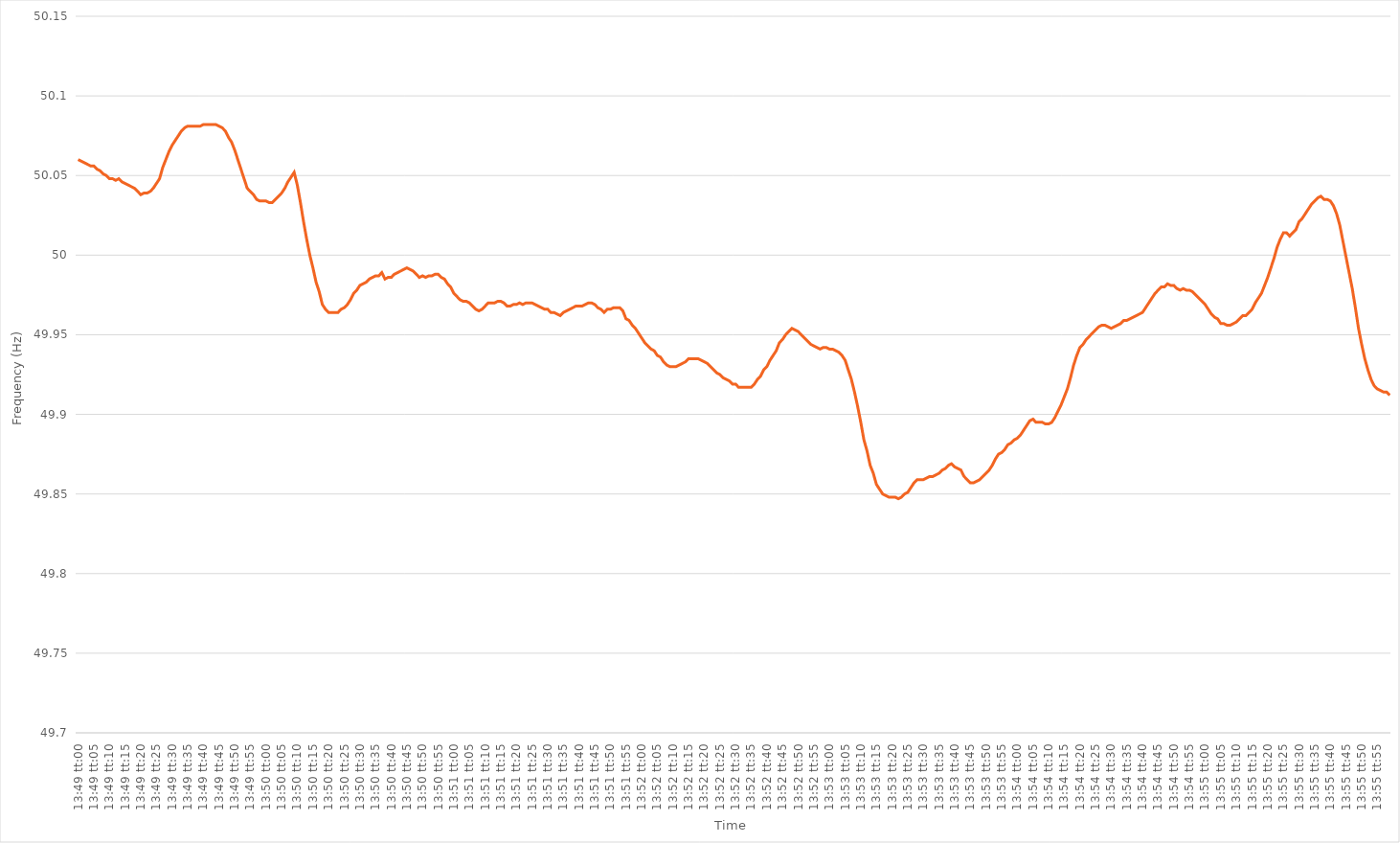
| Category | Series 0 |
|---|---|
| 0.5756944444444444 | 50.06 |
| 0.5757060185185185 | 50.059 |
| 0.5757175925925926 | 50.058 |
| 0.5757291666666667 | 50.057 |
| 0.5757407407407408 | 50.056 |
| 0.5757523148148148 | 50.056 |
| 0.5757638888888889 | 50.054 |
| 0.5757754629629629 | 50.053 |
| 0.575787037037037 | 50.051 |
| 0.5757986111111111 | 50.05 |
| 0.5758101851851852 | 50.048 |
| 0.5758217592592593 | 50.048 |
| 0.5758333333333333 | 50.047 |
| 0.5758449074074073 | 50.048 |
| 0.5758564814814815 | 50.046 |
| 0.5758680555555555 | 50.045 |
| 0.5758796296296297 | 50.044 |
| 0.5758912037037037 | 50.043 |
| 0.5759027777777778 | 50.042 |
| 0.5759143518518518 | 50.04 |
| 0.575925925925926 | 50.038 |
| 0.5759375 | 50.039 |
| 0.5759490740740741 | 50.039 |
| 0.5759606481481482 | 50.04 |
| 0.5759722222222222 | 50.042 |
| 0.5759837962962963 | 50.045 |
| 0.5759953703703703 | 50.048 |
| 0.5760069444444444 | 50.055 |
| 0.5760185185185185 | 50.06 |
| 0.5760300925925926 | 50.065 |
| 0.5760416666666667 | 50.069 |
| 0.5760532407407407 | 50.072 |
| 0.5760648148148148 | 50.075 |
| 0.5760763888888889 | 50.078 |
| 0.5760879629629629 | 50.08 |
| 0.5760995370370371 | 50.081 |
| 0.5761111111111111 | 50.081 |
| 0.5761226851851852 | 50.081 |
| 0.5761342592592592 | 50.081 |
| 0.5761458333333334 | 50.081 |
| 0.5761574074074074 | 50.082 |
| 0.5761689814814815 | 50.082 |
| 0.5761805555555556 | 50.082 |
| 0.5761921296296296 | 50.082 |
| 0.5762037037037037 | 50.082 |
| 0.5762152777777778 | 50.081 |
| 0.5762268518518519 | 50.08 |
| 0.5762384259259259 | 50.078 |
| 0.57625 | 50.074 |
| 0.5762615740740741 | 50.071 |
| 0.5762731481481481 | 50.066 |
| 0.5762847222222222 | 50.06 |
| 0.5762962962962963 | 50.054 |
| 0.5763078703703703 | 50.048 |
| 0.5763194444444445 | 50.042 |
| 0.5763310185185185 | 50.04 |
| 0.5763425925925926 | 50.038 |
| 0.5763541666666666 | 50.035 |
| 0.5763657407407408 | 50.034 |
| 0.5763773148148148 | 50.034 |
| 0.576388888888889 | 50.034 |
| 0.576400462962963 | 50.033 |
| 0.576412037037037 | 50.033 |
| 0.5764236111111111 | 50.035 |
| 0.5764351851851852 | 50.037 |
| 0.5764467592592593 | 50.039 |
| 0.5764583333333334 | 50.042 |
| 0.5764699074074074 | 50.046 |
| 0.5764814814814815 | 50.049 |
| 0.5764930555555555 | 50.052 |
| 0.5765046296296296 | 50.044 |
| 0.5765162037037037 | 50.033 |
| 0.5765277777777778 | 50.021 |
| 0.5765393518518519 | 50.01 |
| 0.5765509259259259 | 50 |
| 0.5765625 | 49.992 |
| 0.576574074074074 | 49.983 |
| 0.5765856481481482 | 49.977 |
| 0.5765972222222222 | 49.969 |
| 0.5766087962962964 | 49.966 |
| 0.5766203703703704 | 49.964 |
| 0.5766319444444444 | 49.964 |
| 0.5766435185185185 | 49.964 |
| 0.5766550925925926 | 49.964 |
| 0.5766666666666667 | 49.966 |
| 0.5766782407407408 | 49.967 |
| 0.5766898148148148 | 49.969 |
| 0.5767013888888889 | 49.972 |
| 0.5767129629629629 | 49.976 |
| 0.576724537037037 | 49.978 |
| 0.5767361111111111 | 49.981 |
| 0.5767476851851852 | 49.982 |
| 0.5767592592592593 | 49.983 |
| 0.5767708333333333 | 49.985 |
| 0.5767824074074074 | 49.986 |
| 0.5767939814814814 | 49.987 |
| 0.5768055555555556 | 49.987 |
| 0.5768171296296296 | 49.989 |
| 0.5768287037037038 | 49.985 |
| 0.5768402777777778 | 49.986 |
| 0.5768518518518518 | 49.986 |
| 0.5768634259259259 | 49.988 |
| 0.576875 | 49.989 |
| 0.5768865740740741 | 49.99 |
| 0.5768981481481482 | 49.991 |
| 0.5769097222222223 | 49.992 |
| 0.5769212962962963 | 49.991 |
| 0.5769328703703703 | 49.99 |
| 0.5769444444444444 | 49.988 |
| 0.5769560185185185 | 49.986 |
| 0.5769675925925926 | 49.987 |
| 0.5769791666666667 | 49.986 |
| 0.5769907407407407 | 49.987 |
| 0.5770023148148148 | 49.987 |
| 0.5770138888888888 | 49.988 |
| 0.577025462962963 | 49.988 |
| 0.577037037037037 | 49.986 |
| 0.5770486111111112 | 49.985 |
| 0.5770601851851852 | 49.982 |
| 0.5770717592592592 | 49.98 |
| 0.5770833333333333 | 49.976 |
| 0.5770949074074074 | 49.974 |
| 0.5771064814814815 | 49.972 |
| 0.5771180555555556 | 49.971 |
| 0.5771296296296297 | 49.971 |
| 0.5771412037037037 | 49.97 |
| 0.5771527777777777 | 49.968 |
| 0.5771643518518519 | 49.966 |
| 0.5771759259259259 | 49.965 |
| 0.5771875 | 49.966 |
| 0.5771990740740741 | 49.968 |
| 0.5772106481481482 | 49.97 |
| 0.5772222222222222 | 49.97 |
| 0.5772337962962962 | 49.97 |
| 0.5772453703703704 | 49.971 |
| 0.5772569444444444 | 49.971 |
| 0.5772685185185186 | 49.97 |
| 0.5772800925925926 | 49.968 |
| 0.5772916666666666 | 49.968 |
| 0.5773032407407407 | 49.969 |
| 0.5773148148148148 | 49.969 |
| 0.5773263888888889 | 49.97 |
| 0.577337962962963 | 49.969 |
| 0.5773495370370371 | 49.97 |
| 0.5773611111111111 | 49.97 |
| 0.5773726851851851 | 49.97 |
| 0.5773842592592593 | 49.969 |
| 0.5773958333333333 | 49.968 |
| 0.5774074074074075 | 49.967 |
| 0.5774189814814815 | 49.966 |
| 0.5774305555555556 | 49.966 |
| 0.5774421296296296 | 49.964 |
| 0.5774537037037036 | 49.964 |
| 0.5774652777777778 | 49.963 |
| 0.5774768518518518 | 49.962 |
| 0.577488425925926 | 49.964 |
| 0.5775 | 49.965 |
| 0.577511574074074 | 49.966 |
| 0.5775231481481481 | 49.967 |
| 0.5775347222222222 | 49.968 |
| 0.5775462962962963 | 49.968 |
| 0.5775578703703704 | 49.968 |
| 0.5775694444444445 | 49.969 |
| 0.5775810185185185 | 49.97 |
| 0.5775925925925925 | 49.97 |
| 0.5776041666666667 | 49.969 |
| 0.5776157407407407 | 49.967 |
| 0.5776273148148149 | 49.966 |
| 0.5776388888888889 | 49.964 |
| 0.577650462962963 | 49.966 |
| 0.577662037037037 | 49.966 |
| 0.577673611111111 | 49.967 |
| 0.5776851851851852 | 49.967 |
| 0.5776967592592592 | 49.967 |
| 0.5777083333333334 | 49.965 |
| 0.5777199074074074 | 49.96 |
| 0.5777314814814815 | 49.959 |
| 0.5777430555555555 | 49.956 |
| 0.5777546296296296 | 49.954 |
| 0.5777662037037037 | 49.951 |
| 0.5777777777777778 | 49.948 |
| 0.5777893518518519 | 49.945 |
| 0.5778009259259259 | 49.943 |
| 0.5778125 | 49.941 |
| 0.5778240740740741 | 49.94 |
| 0.5778356481481481 | 49.937 |
| 0.5778472222222223 | 49.936 |
| 0.5778587962962963 | 49.933 |
| 0.5778703703703704 | 49.931 |
| 0.5778819444444444 | 49.93 |
| 0.5778935185185184 | 49.93 |
| 0.5779050925925926 | 49.93 |
| 0.5779166666666666 | 49.931 |
| 0.5779282407407408 | 49.932 |
| 0.5779398148148148 | 49.933 |
| 0.5779513888888889 | 49.935 |
| 0.5779629629629629 | 49.935 |
| 0.577974537037037 | 49.935 |
| 0.5779861111111111 | 49.935 |
| 0.5779976851851852 | 49.934 |
| 0.5780092592592593 | 49.933 |
| 0.5780208333333333 | 49.932 |
| 0.5780324074074074 | 49.93 |
| 0.5780439814814815 | 49.928 |
| 0.5780555555555555 | 49.926 |
| 0.5780671296296297 | 49.925 |
| 0.5780787037037037 | 49.923 |
| 0.5780902777777778 | 49.922 |
| 0.5781018518518518 | 49.921 |
| 0.578113425925926 | 49.919 |
| 0.578125 | 49.919 |
| 0.578136574074074 | 49.917 |
| 0.5781481481481482 | 49.917 |
| 0.5781597222222222 | 49.917 |
| 0.5781712962962963 | 49.917 |
| 0.5781828703703703 | 49.917 |
| 0.5781944444444445 | 49.919 |
| 0.5782060185185185 | 49.922 |
| 0.5782175925925926 | 49.924 |
| 0.5782291666666667 | 49.928 |
| 0.5782407407407407 | 49.93 |
| 0.5782523148148148 | 49.934 |
| 0.5782638888888889 | 49.937 |
| 0.578275462962963 | 49.94 |
| 0.5782870370370371 | 49.945 |
| 0.5782986111111111 | 49.947 |
| 0.5783101851851852 | 49.95 |
| 0.5783217592592592 | 49.952 |
| 0.5783333333333334 | 49.954 |
| 0.5783449074074074 | 49.953 |
| 0.5783564814814816 | 49.952 |
| 0.5783680555555556 | 49.95 |
| 0.5783796296296296 | 49.948 |
| 0.5783912037037037 | 49.946 |
| 0.5784027777777777 | 49.944 |
| 0.5784143518518519 | 49.943 |
| 0.5784259259259259 | 49.942 |
| 0.5784375 | 49.941 |
| 0.5784490740740741 | 49.942 |
| 0.5784606481481481 | 49.942 |
| 0.5784722222222222 | 49.941 |
| 0.5784837962962963 | 49.941 |
| 0.5784953703703704 | 49.94 |
| 0.5785069444444445 | 49.939 |
| 0.5785185185185185 | 49.937 |
| 0.5785300925925926 | 49.934 |
| 0.5785416666666666 | 49.928 |
| 0.5785532407407408 | 49.922 |
| 0.5785648148148148 | 49.914 |
| 0.578576388888889 | 49.905 |
| 0.578587962962963 | 49.895 |
| 0.578599537037037 | 49.884 |
| 0.5786111111111111 | 49.877 |
| 0.5786226851851851 | 49.868 |
| 0.5786342592592593 | 49.863 |
| 0.5786458333333333 | 49.856 |
| 0.5786574074074075 | 49.853 |
| 0.5786689814814815 | 49.85 |
| 0.5786805555555555 | 49.849 |
| 0.5786921296296296 | 49.848 |
| 0.5787037037037037 | 49.848 |
| 0.5787152777777778 | 49.848 |
| 0.5787268518518519 | 49.847 |
| 0.578738425925926 | 49.848 |
| 0.57875 | 49.85 |
| 0.578761574074074 | 49.851 |
| 0.5787731481481482 | 49.854 |
| 0.5787847222222222 | 49.857 |
| 0.5787962962962964 | 49.859 |
| 0.5788078703703704 | 49.859 |
| 0.5788194444444444 | 49.859 |
| 0.5788310185185185 | 49.86 |
| 0.5788425925925925 | 49.861 |
| 0.5788541666666667 | 49.861 |
| 0.5788657407407407 | 49.862 |
| 0.5788773148148149 | 49.863 |
| 0.5788888888888889 | 49.865 |
| 0.5789004629629629 | 49.866 |
| 0.578912037037037 | 49.868 |
| 0.5789236111111111 | 49.869 |
| 0.5789351851851852 | 49.867 |
| 0.5789467592592593 | 49.866 |
| 0.5789583333333334 | 49.865 |
| 0.5789699074074074 | 49.861 |
| 0.5789814814814814 | 49.859 |
| 0.5789930555555556 | 49.857 |
| 0.5790046296296296 | 49.857 |
| 0.5790162037037038 | 49.858 |
| 0.5790277777777778 | 49.859 |
| 0.5790393518518518 | 49.861 |
| 0.5790509259259259 | 49.863 |
| 0.5790625 | 49.865 |
| 0.5790740740740741 | 49.868 |
| 0.5790856481481481 | 49.872 |
| 0.5790972222222223 | 49.875 |
| 0.5791087962962963 | 49.876 |
| 0.5791203703703703 | 49.878 |
| 0.5791319444444444 | 49.881 |
| 0.5791435185185185 | 49.882 |
| 0.5791550925925926 | 49.884 |
| 0.5791666666666667 | 49.885 |
| 0.5791782407407408 | 49.887 |
| 0.5791898148148148 | 49.89 |
| 0.5792013888888888 | 49.893 |
| 0.579212962962963 | 49.896 |
| 0.579224537037037 | 49.897 |
| 0.5792361111111112 | 49.895 |
| 0.5792476851851852 | 49.895 |
| 0.5792592592592593 | 49.895 |
| 0.5792708333333333 | 49.894 |
| 0.5792824074074074 | 49.894 |
| 0.5792939814814815 | 49.895 |
| 0.5793055555555556 | 49.898 |
| 0.5793171296296297 | 49.902 |
| 0.5793287037037037 | 49.906 |
| 0.5793402777777777 | 49.911 |
| 0.5793518518518518 | 49.916 |
| 0.5793634259259259 | 49.923 |
| 0.579375 | 49.931 |
| 0.5793865740740741 | 49.937 |
| 0.5793981481481482 | 49.942 |
| 0.5794097222222222 | 49.944 |
| 0.5794212962962962 | 49.947 |
| 0.5794328703703704 | 49.949 |
| 0.5794444444444444 | 49.951 |
| 0.5794560185185186 | 49.953 |
| 0.5794675925925926 | 49.955 |
| 0.5794791666666667 | 49.956 |
| 0.5794907407407407 | 49.956 |
| 0.5795023148148148 | 49.955 |
| 0.5795138888888889 | 49.954 |
| 0.579525462962963 | 49.955 |
| 0.5795370370370371 | 49.956 |
| 0.5795486111111111 | 49.957 |
| 0.5795601851851852 | 49.959 |
| 0.5795717592592592 | 49.959 |
| 0.5795833333333333 | 49.96 |
| 0.5795949074074074 | 49.961 |
| 0.5796064814814815 | 49.962 |
| 0.5796180555555556 | 49.963 |
| 0.5796296296296296 | 49.964 |
| 0.5796412037037036 | 49.967 |
| 0.5796527777777778 | 49.97 |
| 0.5796643518518518 | 49.973 |
| 0.579675925925926 | 49.976 |
| 0.5796875 | 49.978 |
| 0.5796990740740741 | 49.98 |
| 0.5797106481481481 | 49.98 |
| 0.5797222222222222 | 49.982 |
| 0.5797337962962963 | 49.981 |
| 0.5797453703703704 | 49.981 |
| 0.5797569444444445 | 49.979 |
| 0.5797685185185185 | 49.978 |
| 0.5797800925925926 | 49.979 |
| 0.5797916666666666 | 49.978 |
| 0.5798032407407407 | 49.978 |
| 0.5798148148148148 | 49.977 |
| 0.5798263888888889 | 49.975 |
| 0.579837962962963 | 49.973 |
| 0.579849537037037 | 49.971 |
| 0.579861111111111 | 49.969 |
| 0.5798726851851852 | 49.966 |
| 0.5798842592592592 | 49.963 |
| 0.5798958333333334 | 49.961 |
| 0.5799074074074074 | 49.96 |
| 0.5799189814814815 | 49.957 |
| 0.5799305555555555 | 49.957 |
| 0.5799421296296297 | 49.956 |
| 0.5799537037037037 | 49.956 |
| 0.5799652777777778 | 49.957 |
| 0.5799768518518519 | 49.958 |
| 0.5799884259259259 | 49.96 |
| 0.58 | 49.962 |
| 0.5800115740740741 | 49.962 |
| 0.5800231481481481 | 49.964 |
| 0.5800347222222222 | 49.966 |
| 0.5800462962962963 | 49.97 |
| 0.5800578703703704 | 49.973 |
| 0.5800694444444444 | 49.976 |
| 0.5800810185185185 | 49.981 |
| 0.5800925925925926 | 49.986 |
| 0.5801041666666666 | 49.992 |
| 0.5801157407407408 | 49.998 |
| 0.5801273148148148 | 50.005 |
| 0.5801388888888889 | 50.01 |
| 0.5801504629629629 | 50.014 |
| 0.5801620370370371 | 50.014 |
| 0.5801736111111111 | 50.012 |
| 0.5801851851851852 | 50.014 |
| 0.5801967592592593 | 50.016 |
| 0.5802083333333333 | 50.021 |
| 0.5802199074074074 | 50.023 |
| 0.5802314814814815 | 50.026 |
| 0.5802430555555556 | 50.029 |
| 0.5802546296296297 | 50.032 |
| 0.5802662037037037 | 50.034 |
| 0.5802777777777778 | 50.036 |
| 0.5802893518518518 | 50.037 |
| 0.5803009259259259 | 50.035 |
| 0.5803125 | 50.035 |
| 0.580324074074074 | 50.034 |
| 0.5803356481481482 | 50.031 |
| 0.5803472222222222 | 50.026 |
| 0.5803587962962963 | 50.019 |
| 0.5803703703703703 | 50.009 |
| 0.5803819444444445 | 49.999 |
| 0.5803935185185185 | 49.989 |
| 0.5804050925925927 | 49.979 |
| 0.5804166666666667 | 49.967 |
| 0.5804282407407407 | 49.954 |
| 0.5804398148148148 | 49.944 |
| 0.5804513888888889 | 49.935 |
| 0.580462962962963 | 49.928 |
| 0.5804745370370371 | 49.922 |
| 0.5804861111111111 | 49.918 |
| 0.5804976851851852 | 49.916 |
| 0.5805092592592592 | 49.915 |
| 0.5805208333333333 | 49.914 |
| 0.5805324074074074 | 49.914 |
| 0.5805439814814815 | 49.912 |